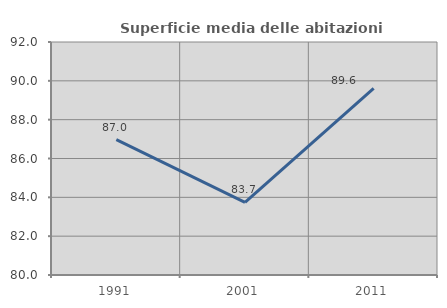
| Category | Superficie media delle abitazioni occupate |
|---|---|
| 1991.0 | 86.97 |
| 2001.0 | 83.74 |
| 2011.0 | 89.615 |